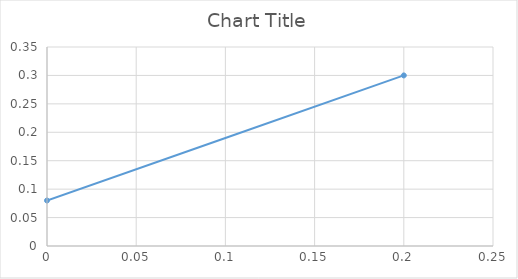
| Category | Series 0 |
|---|---|
| 0.0 | 0.08 |
| 0.2 | 0.3 |